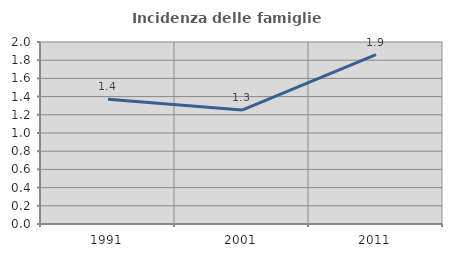
| Category | Incidenza delle famiglie numerose |
|---|---|
| 1991.0 | 1.37 |
| 2001.0 | 1.252 |
| 2011.0 | 1.861 |